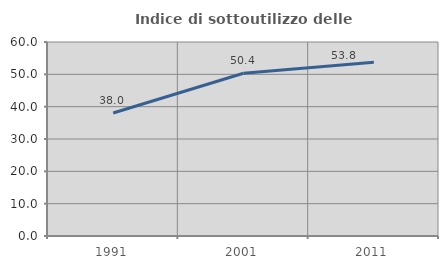
| Category | Indice di sottoutilizzo delle abitazioni  |
|---|---|
| 1991.0 | 38.046 |
| 2001.0 | 50.353 |
| 2011.0 | 53.759 |